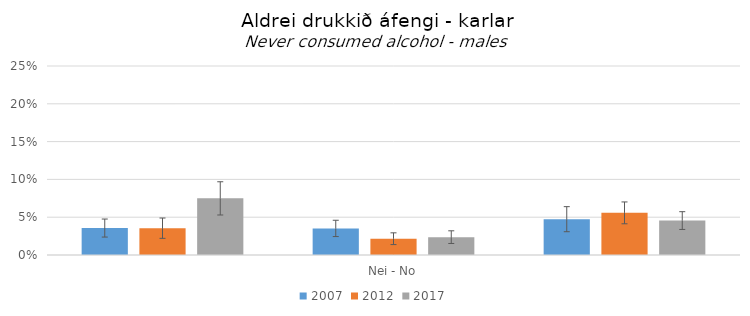
| Category | 2007 | 2012 | 2017 |
|---|---|---|---|
| 0 | 0.036 | 0.035 | 0.075 |
| 1 | 0.035 | 0.022 | 0.024 |
| 2 | 0.047 | 0.056 | 0.046 |